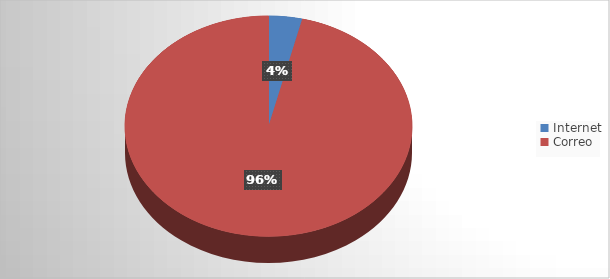
| Category | Series 0 |
|---|---|
| Internet | 2 |
| Correo | 51 |